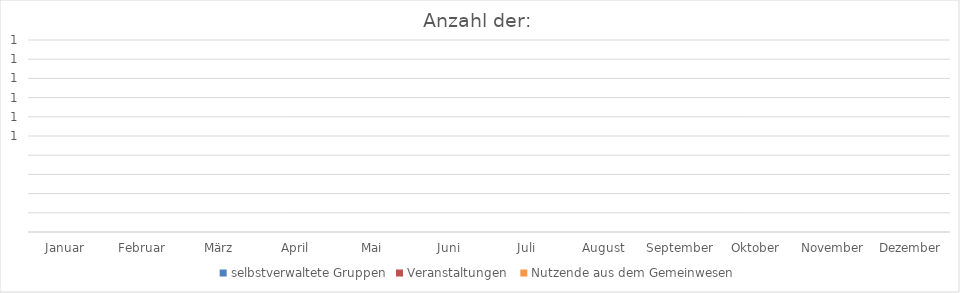
| Category | selbstverwaltete Gruppen | Veranstaltungen  | Nutzende aus dem Gemeinwesen |
|---|---|---|---|
| Januar | 0 | 0 | 0 |
| Februar | 0 | 0 | 0 |
| März | 0 | 0 | 0 |
| April | 0 | 0 | 0 |
| Mai | 0 | 0 | 0 |
| Juni | 0 | 0 | 0 |
| Juli | 0 | 0 | 0 |
| August | 0 | 0 | 0 |
| September | 0 | 0 | 0 |
| Oktober | 0 | 0 | 0 |
| November | 0 | 0 | 0 |
| Dezember | 0 | 0 | 0 |